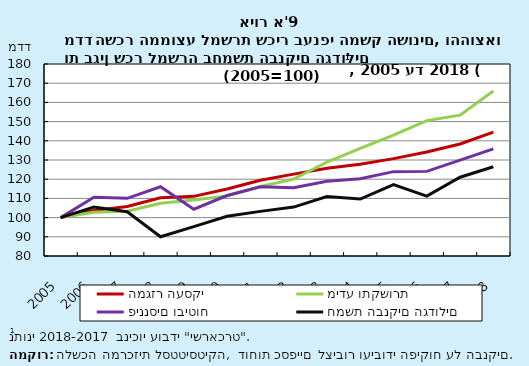
| Category | המגזר העסקי | מידע ותקשורת | פיננסים וביטוח | חמשת הבנקים הגדולים |
|---|---|---|---|---|
| 2005-12-31 | 100 | 100 | 100 | 100 |
| 2006-12-31 | 103.745 | 102.782 | 110.566 | 105.516 |
| 2007-12-31 | 105.787 | 103.279 | 110.029 | 103.039 |
| 2008-12-31 | 110.351 | 107.496 | 116.058 | 90.043 |
| 2009-12-31 | 111.07 | 109.127 | 104.374 | 95.326 |
| 2010-12-31 | 114.918 | 111.261 | 111.493 | 100.668 |
| 2011-12-31 | 119.474 | 116.16 | 116.066 | 103.243 |
| 2012-12-31 | 122.645 | 120.017 | 115.583 | 105.465 |
| 2013-12-31 | 125.751 | 128.904 | 118.98 | 110.966 |
| 2014-12-31 | 127.832 | 136.068 | 120.194 | 109.674 |
| 2015-12-31 | 130.716 | 142.911 | 123.943 | 117.221 |
| 2016-12-31 | 134.149 | 150.514 | 124.075 | 111.217 |
| 2017-12-31 | 138.352 | 153.336 | 129.93 | 121.021 |
| 2018-12-31 | 144.5 | 165.921 | 135.821 | 126.484 |